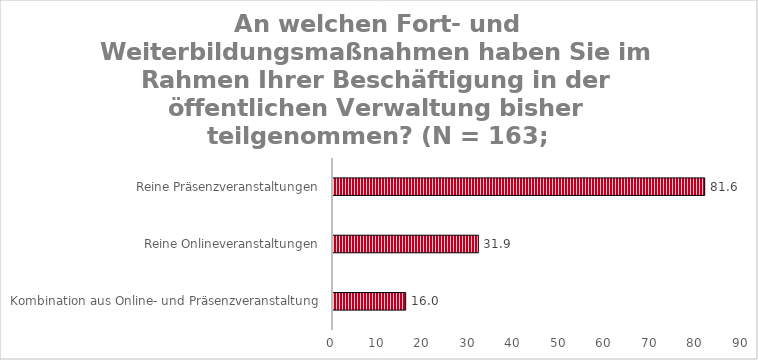
| Category | Series 0 |
|---|---|
| Kombination aus Online- und Präsenzveranstaltung | 15.951 |
| Reine Onlineveranstaltungen | 31.902 |
| Reine Präsenzveranstaltungen | 81.595 |